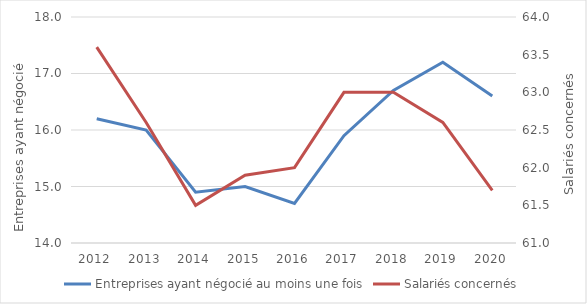
| Category | Entreprises ayant négocié au moins une fois |
|---|---|
| 2012.0 | 16.2 |
| 2013.0 | 16 |
| 2014.0 | 14.9 |
| 2015.0 | 15 |
| 2016.0 | 14.7 |
| 2017.0 | 15.9 |
| 2018.0 | 16.7 |
| 2019.0 | 17.2 |
| 2020.0 | 16.6 |